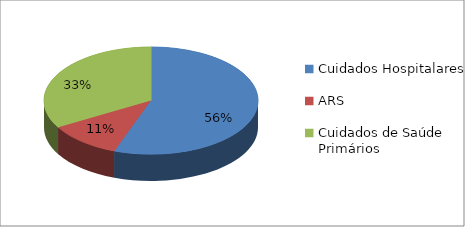
| Category | Series 0 |
|---|---|
| Cuidados Hospitalares | 5 |
| ARS | 1 |
| Cuidados de Saúde Primários | 3 |